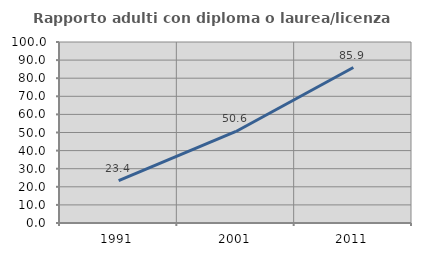
| Category | Rapporto adulti con diploma o laurea/licenza media  |
|---|---|
| 1991.0 | 23.438 |
| 2001.0 | 50.562 |
| 2011.0 | 85.903 |